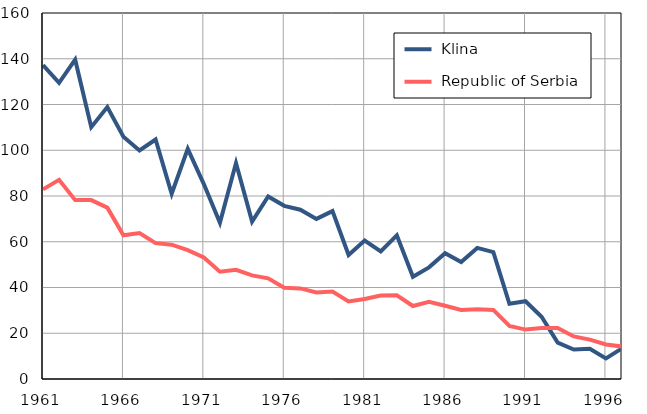
| Category |  Klina |  Republic of Serbia |
|---|---|---|
| 1961.0 | 137.2 | 82.9 |
| 1962.0 | 129.5 | 87.1 |
| 1963.0 | 139.6 | 78.2 |
| 1964.0 | 110.1 | 78.2 |
| 1965.0 | 118.9 | 74.9 |
| 1966.0 | 105.9 | 62.8 |
| 1967.0 | 99.9 | 63.8 |
| 1968.0 | 104.7 | 59.4 |
| 1969.0 | 81 | 58.7 |
| 1970.0 | 100.6 | 56.3 |
| 1971.0 | 85.2 | 53.1 |
| 1972.0 | 68.3 | 46.9 |
| 1973.0 | 94.4 | 47.7 |
| 1974.0 | 68.8 | 45.3 |
| 1975.0 | 79.8 | 44 |
| 1976.0 | 75.7 | 39.9 |
| 1977.0 | 74 | 39.6 |
| 1978.0 | 70 | 37.8 |
| 1979.0 | 73.4 | 38.2 |
| 1980.0 | 54.2 | 33.9 |
| 1981.0 | 60.5 | 35 |
| 1982.0 | 55.8 | 36.5 |
| 1983.0 | 62.8 | 36.6 |
| 1984.0 | 44.7 | 31.9 |
| 1985.0 | 48.8 | 33.7 |
| 1986.0 | 55 | 32 |
| 1987.0 | 51.1 | 30.2 |
| 1988.0 | 57.3 | 30.5 |
| 1989.0 | 55.5 | 30.2 |
| 1990.0 | 32.9 | 23.2 |
| 1991.0 | 34 | 21.6 |
| 1992.0 | 27.2 | 22.3 |
| 1993.0 | 15.9 | 22.3 |
| 1994.0 | 12.9 | 18.6 |
| 1995.0 | 13.2 | 17.2 |
| 1996.0 | 9 | 15.1 |
| 1997.0 | 13.4 | 14.2 |